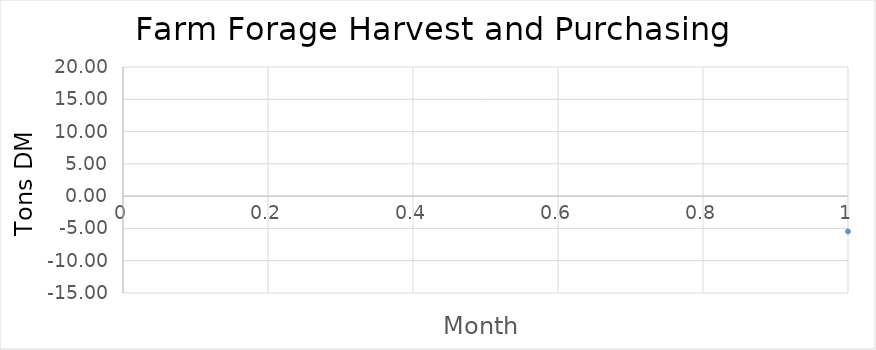
| Category | Series 0 |
|---|---|
| 0 | -5.466 |
| 1 | -6.141 |
| 2 | -6.366 |
| 3 | -5.682 |
| 4 | 14.63 |
| 5 | 12.343 |
| 6 | 7.086 |
| 7 | 8.829 |
| 8 | 5.304 |
| 9 | -3.207 |
| 10 | -10.384 |
| 11 | -11.542 |